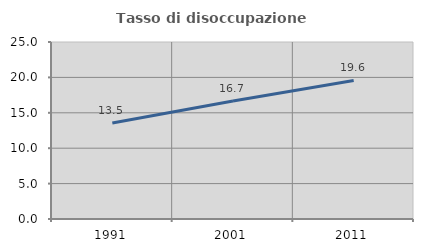
| Category | Tasso di disoccupazione giovanile  |
|---|---|
| 1991.0 | 13.546 |
| 2001.0 | 16.667 |
| 2011.0 | 19.565 |